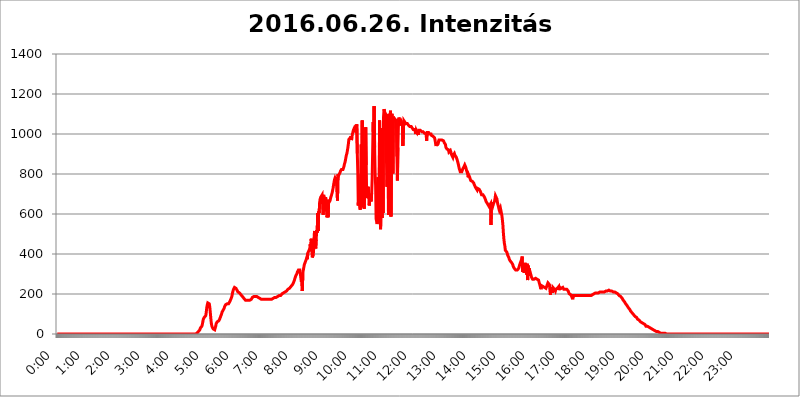
| Category | 2016.06.26. Intenzitás [W/m^2] |
|---|---|
| 0.0 | 0 |
| 0.0006944444444444445 | 0 |
| 0.001388888888888889 | 0 |
| 0.0020833333333333333 | 0 |
| 0.002777777777777778 | 0 |
| 0.003472222222222222 | 0 |
| 0.004166666666666667 | 0 |
| 0.004861111111111111 | 0 |
| 0.005555555555555556 | 0 |
| 0.0062499999999999995 | 0 |
| 0.006944444444444444 | 0 |
| 0.007638888888888889 | 0 |
| 0.008333333333333333 | 0 |
| 0.009027777777777779 | 0 |
| 0.009722222222222222 | 0 |
| 0.010416666666666666 | 0 |
| 0.011111111111111112 | 0 |
| 0.011805555555555555 | 0 |
| 0.012499999999999999 | 0 |
| 0.013194444444444444 | 0 |
| 0.013888888888888888 | 0 |
| 0.014583333333333332 | 0 |
| 0.015277777777777777 | 0 |
| 0.015972222222222224 | 0 |
| 0.016666666666666666 | 0 |
| 0.017361111111111112 | 0 |
| 0.018055555555555557 | 0 |
| 0.01875 | 0 |
| 0.019444444444444445 | 0 |
| 0.02013888888888889 | 0 |
| 0.020833333333333332 | 0 |
| 0.02152777777777778 | 0 |
| 0.022222222222222223 | 0 |
| 0.02291666666666667 | 0 |
| 0.02361111111111111 | 0 |
| 0.024305555555555556 | 0 |
| 0.024999999999999998 | 0 |
| 0.025694444444444447 | 0 |
| 0.02638888888888889 | 0 |
| 0.027083333333333334 | 0 |
| 0.027777777777777776 | 0 |
| 0.02847222222222222 | 0 |
| 0.029166666666666664 | 0 |
| 0.029861111111111113 | 0 |
| 0.030555555555555555 | 0 |
| 0.03125 | 0 |
| 0.03194444444444445 | 0 |
| 0.03263888888888889 | 0 |
| 0.03333333333333333 | 0 |
| 0.034027777777777775 | 0 |
| 0.034722222222222224 | 0 |
| 0.035416666666666666 | 0 |
| 0.036111111111111115 | 0 |
| 0.03680555555555556 | 0 |
| 0.0375 | 0 |
| 0.03819444444444444 | 0 |
| 0.03888888888888889 | 0 |
| 0.03958333333333333 | 0 |
| 0.04027777777777778 | 0 |
| 0.04097222222222222 | 0 |
| 0.041666666666666664 | 0 |
| 0.042361111111111106 | 0 |
| 0.04305555555555556 | 0 |
| 0.043750000000000004 | 0 |
| 0.044444444444444446 | 0 |
| 0.04513888888888889 | 0 |
| 0.04583333333333334 | 0 |
| 0.04652777777777778 | 0 |
| 0.04722222222222222 | 0 |
| 0.04791666666666666 | 0 |
| 0.04861111111111111 | 0 |
| 0.049305555555555554 | 0 |
| 0.049999999999999996 | 0 |
| 0.05069444444444445 | 0 |
| 0.051388888888888894 | 0 |
| 0.052083333333333336 | 0 |
| 0.05277777777777778 | 0 |
| 0.05347222222222222 | 0 |
| 0.05416666666666667 | 0 |
| 0.05486111111111111 | 0 |
| 0.05555555555555555 | 0 |
| 0.05625 | 0 |
| 0.05694444444444444 | 0 |
| 0.057638888888888885 | 0 |
| 0.05833333333333333 | 0 |
| 0.05902777777777778 | 0 |
| 0.059722222222222225 | 0 |
| 0.06041666666666667 | 0 |
| 0.061111111111111116 | 0 |
| 0.06180555555555556 | 0 |
| 0.0625 | 0 |
| 0.06319444444444444 | 0 |
| 0.06388888888888888 | 0 |
| 0.06458333333333334 | 0 |
| 0.06527777777777778 | 0 |
| 0.06597222222222222 | 0 |
| 0.06666666666666667 | 0 |
| 0.06736111111111111 | 0 |
| 0.06805555555555555 | 0 |
| 0.06874999999999999 | 0 |
| 0.06944444444444443 | 0 |
| 0.07013888888888889 | 0 |
| 0.07083333333333333 | 0 |
| 0.07152777777777779 | 0 |
| 0.07222222222222223 | 0 |
| 0.07291666666666667 | 0 |
| 0.07361111111111111 | 0 |
| 0.07430555555555556 | 0 |
| 0.075 | 0 |
| 0.07569444444444444 | 0 |
| 0.0763888888888889 | 0 |
| 0.07708333333333334 | 0 |
| 0.07777777777777778 | 0 |
| 0.07847222222222222 | 0 |
| 0.07916666666666666 | 0 |
| 0.0798611111111111 | 0 |
| 0.08055555555555556 | 0 |
| 0.08125 | 0 |
| 0.08194444444444444 | 0 |
| 0.08263888888888889 | 0 |
| 0.08333333333333333 | 0 |
| 0.08402777777777777 | 0 |
| 0.08472222222222221 | 0 |
| 0.08541666666666665 | 0 |
| 0.08611111111111112 | 0 |
| 0.08680555555555557 | 0 |
| 0.08750000000000001 | 0 |
| 0.08819444444444445 | 0 |
| 0.08888888888888889 | 0 |
| 0.08958333333333333 | 0 |
| 0.09027777777777778 | 0 |
| 0.09097222222222222 | 0 |
| 0.09166666666666667 | 0 |
| 0.09236111111111112 | 0 |
| 0.09305555555555556 | 0 |
| 0.09375 | 0 |
| 0.09444444444444444 | 0 |
| 0.09513888888888888 | 0 |
| 0.09583333333333333 | 0 |
| 0.09652777777777777 | 0 |
| 0.09722222222222222 | 0 |
| 0.09791666666666667 | 0 |
| 0.09861111111111111 | 0 |
| 0.09930555555555555 | 0 |
| 0.09999999999999999 | 0 |
| 0.10069444444444443 | 0 |
| 0.1013888888888889 | 0 |
| 0.10208333333333335 | 0 |
| 0.10277777777777779 | 0 |
| 0.10347222222222223 | 0 |
| 0.10416666666666667 | 0 |
| 0.10486111111111111 | 0 |
| 0.10555555555555556 | 0 |
| 0.10625 | 0 |
| 0.10694444444444444 | 0 |
| 0.1076388888888889 | 0 |
| 0.10833333333333334 | 0 |
| 0.10902777777777778 | 0 |
| 0.10972222222222222 | 0 |
| 0.1111111111111111 | 0 |
| 0.11180555555555556 | 0 |
| 0.11180555555555556 | 0 |
| 0.1125 | 0 |
| 0.11319444444444444 | 0 |
| 0.11388888888888889 | 0 |
| 0.11458333333333333 | 0 |
| 0.11527777777777777 | 0 |
| 0.11597222222222221 | 0 |
| 0.11666666666666665 | 0 |
| 0.1173611111111111 | 0 |
| 0.11805555555555557 | 0 |
| 0.11944444444444445 | 0 |
| 0.12013888888888889 | 0 |
| 0.12083333333333333 | 0 |
| 0.12152777777777778 | 0 |
| 0.12222222222222223 | 0 |
| 0.12291666666666667 | 0 |
| 0.12291666666666667 | 0 |
| 0.12361111111111112 | 0 |
| 0.12430555555555556 | 0 |
| 0.125 | 0 |
| 0.12569444444444444 | 0 |
| 0.12638888888888888 | 0 |
| 0.12708333333333333 | 0 |
| 0.16875 | 0 |
| 0.12847222222222224 | 0 |
| 0.12916666666666668 | 0 |
| 0.12986111111111112 | 0 |
| 0.13055555555555556 | 0 |
| 0.13125 | 0 |
| 0.13194444444444445 | 0 |
| 0.1326388888888889 | 0 |
| 0.13333333333333333 | 0 |
| 0.13402777777777777 | 0 |
| 0.13402777777777777 | 0 |
| 0.13472222222222222 | 0 |
| 0.13541666666666666 | 0 |
| 0.1361111111111111 | 0 |
| 0.13749999999999998 | 0 |
| 0.13819444444444443 | 0 |
| 0.1388888888888889 | 0 |
| 0.13958333333333334 | 0 |
| 0.14027777777777778 | 0 |
| 0.14097222222222222 | 0 |
| 0.14166666666666666 | 0 |
| 0.1423611111111111 | 0 |
| 0.14305555555555557 | 0 |
| 0.14375000000000002 | 0 |
| 0.14444444444444446 | 0 |
| 0.1451388888888889 | 0 |
| 0.1451388888888889 | 0 |
| 0.14652777777777778 | 0 |
| 0.14722222222222223 | 0 |
| 0.14791666666666667 | 0 |
| 0.1486111111111111 | 0 |
| 0.14930555555555555 | 0 |
| 0.15 | 0 |
| 0.15069444444444444 | 0 |
| 0.15138888888888888 | 0 |
| 0.15208333333333332 | 0 |
| 0.15277777777777776 | 0 |
| 0.15347222222222223 | 0 |
| 0.15416666666666667 | 0 |
| 0.15486111111111112 | 0 |
| 0.15555555555555556 | 0 |
| 0.15625 | 0 |
| 0.15694444444444444 | 0 |
| 0.15763888888888888 | 0 |
| 0.15833333333333333 | 0 |
| 0.15902777777777777 | 0 |
| 0.15972222222222224 | 0 |
| 0.16041666666666668 | 0 |
| 0.16111111111111112 | 0 |
| 0.16180555555555556 | 0 |
| 0.1625 | 0 |
| 0.16319444444444445 | 0 |
| 0.1638888888888889 | 0 |
| 0.16458333333333333 | 0 |
| 0.16527777777777777 | 0 |
| 0.16597222222222222 | 0 |
| 0.16666666666666666 | 0 |
| 0.1673611111111111 | 0 |
| 0.16805555555555554 | 0 |
| 0.16874999999999998 | 0 |
| 0.16944444444444443 | 0 |
| 0.17013888888888887 | 0 |
| 0.1708333333333333 | 0 |
| 0.17152777777777775 | 0 |
| 0.17222222222222225 | 0 |
| 0.1729166666666667 | 0 |
| 0.17361111111111113 | 0 |
| 0.17430555555555557 | 0 |
| 0.17500000000000002 | 0 |
| 0.17569444444444446 | 0 |
| 0.1763888888888889 | 0 |
| 0.17708333333333334 | 0 |
| 0.17777777777777778 | 0 |
| 0.17847222222222223 | 0 |
| 0.17916666666666667 | 0 |
| 0.1798611111111111 | 0 |
| 0.18055555555555555 | 0 |
| 0.18125 | 0 |
| 0.18194444444444444 | 0 |
| 0.1826388888888889 | 0 |
| 0.18333333333333335 | 0 |
| 0.1840277777777778 | 0 |
| 0.18472222222222223 | 0 |
| 0.18541666666666667 | 0 |
| 0.18611111111111112 | 0 |
| 0.18680555555555556 | 0 |
| 0.1875 | 0 |
| 0.18819444444444444 | 0 |
| 0.18888888888888888 | 0 |
| 0.18958333333333333 | 0 |
| 0.19027777777777777 | 0 |
| 0.1909722222222222 | 0 |
| 0.19166666666666665 | 0 |
| 0.19236111111111112 | 0 |
| 0.19305555555555554 | 0 |
| 0.19375 | 0 |
| 0.19444444444444445 | 0 |
| 0.1951388888888889 | 0 |
| 0.19583333333333333 | 3.525 |
| 0.19652777777777777 | 3.525 |
| 0.19722222222222222 | 7.887 |
| 0.19791666666666666 | 12.257 |
| 0.1986111111111111 | 16.636 |
| 0.19930555555555554 | 16.636 |
| 0.19999999999999998 | 21.024 |
| 0.20069444444444443 | 29.823 |
| 0.20138888888888887 | 29.823 |
| 0.2020833333333333 | 34.234 |
| 0.2027777777777778 | 38.653 |
| 0.2034722222222222 | 47.511 |
| 0.2041666666666667 | 60.85 |
| 0.20486111111111113 | 74.246 |
| 0.20555555555555557 | 78.722 |
| 0.20625000000000002 | 83.205 |
| 0.20694444444444446 | 83.205 |
| 0.2076388888888889 | 87.692 |
| 0.20833333333333334 | 92.184 |
| 0.20902777777777778 | 110.201 |
| 0.20972222222222223 | 132.814 |
| 0.21041666666666667 | 146.423 |
| 0.2111111111111111 | 155.509 |
| 0.21180555555555555 | 155.509 |
| 0.2125 | 155.509 |
| 0.21319444444444444 | 150.964 |
| 0.2138888888888889 | 137.347 |
| 0.21458333333333335 | 110.201 |
| 0.2152777777777778 | 83.205 |
| 0.21597222222222223 | 56.398 |
| 0.21666666666666667 | 43.079 |
| 0.21736111111111112 | 34.234 |
| 0.21805555555555556 | 29.823 |
| 0.21875 | 25.419 |
| 0.21944444444444444 | 25.419 |
| 0.22013888888888888 | 21.024 |
| 0.22083333333333333 | 21.024 |
| 0.22152777777777777 | 29.823 |
| 0.2222222222222222 | 38.653 |
| 0.22291666666666665 | 51.951 |
| 0.2236111111111111 | 56.398 |
| 0.22430555555555556 | 60.85 |
| 0.225 | 65.31 |
| 0.22569444444444445 | 65.31 |
| 0.2263888888888889 | 65.31 |
| 0.22708333333333333 | 69.775 |
| 0.22777777777777777 | 74.246 |
| 0.22847222222222222 | 78.722 |
| 0.22916666666666666 | 87.692 |
| 0.2298611111111111 | 92.184 |
| 0.23055555555555554 | 101.184 |
| 0.23124999999999998 | 110.201 |
| 0.23194444444444443 | 110.201 |
| 0.23263888888888887 | 119.235 |
| 0.2333333333333333 | 123.758 |
| 0.2340277777777778 | 128.284 |
| 0.2347222222222222 | 137.347 |
| 0.2354166666666667 | 137.347 |
| 0.23611111111111113 | 146.423 |
| 0.23680555555555557 | 150.964 |
| 0.23750000000000002 | 150.964 |
| 0.23819444444444446 | 150.964 |
| 0.2388888888888889 | 150.964 |
| 0.23958333333333334 | 150.964 |
| 0.24027777777777778 | 150.964 |
| 0.24097222222222223 | 146.423 |
| 0.24166666666666667 | 146.423 |
| 0.2423611111111111 | 164.605 |
| 0.24305555555555555 | 164.605 |
| 0.24375 | 164.605 |
| 0.24444444444444446 | 182.82 |
| 0.24513888888888888 | 191.937 |
| 0.24583333333333335 | 205.62 |
| 0.2465277777777778 | 214.746 |
| 0.24722222222222223 | 223.873 |
| 0.24791666666666667 | 228.436 |
| 0.24861111111111112 | 233 |
| 0.24930555555555556 | 233 |
| 0.25 | 233 |
| 0.25069444444444444 | 228.436 |
| 0.2513888888888889 | 223.873 |
| 0.2520833333333333 | 219.309 |
| 0.25277777777777777 | 214.746 |
| 0.2534722222222222 | 210.182 |
| 0.25416666666666665 | 210.182 |
| 0.2548611111111111 | 205.62 |
| 0.2555555555555556 | 205.62 |
| 0.25625000000000003 | 201.058 |
| 0.2569444444444445 | 201.058 |
| 0.2576388888888889 | 196.497 |
| 0.25833333333333336 | 191.937 |
| 0.2590277777777778 | 191.937 |
| 0.25972222222222224 | 187.378 |
| 0.2604166666666667 | 182.82 |
| 0.2611111111111111 | 182.82 |
| 0.26180555555555557 | 178.264 |
| 0.2625 | 173.709 |
| 0.26319444444444445 | 173.709 |
| 0.2638888888888889 | 169.156 |
| 0.26458333333333334 | 169.156 |
| 0.2652777777777778 | 169.156 |
| 0.2659722222222222 | 169.156 |
| 0.26666666666666666 | 169.156 |
| 0.2673611111111111 | 169.156 |
| 0.26805555555555555 | 169.156 |
| 0.26875 | 169.156 |
| 0.26944444444444443 | 169.156 |
| 0.2701388888888889 | 169.156 |
| 0.2708333333333333 | 169.156 |
| 0.27152777777777776 | 173.709 |
| 0.2722222222222222 | 173.709 |
| 0.27291666666666664 | 178.264 |
| 0.2736111111111111 | 182.82 |
| 0.2743055555555555 | 182.82 |
| 0.27499999999999997 | 182.82 |
| 0.27569444444444446 | 187.378 |
| 0.27638888888888885 | 187.378 |
| 0.27708333333333335 | 187.378 |
| 0.2777777777777778 | 187.378 |
| 0.27847222222222223 | 187.378 |
| 0.2791666666666667 | 187.378 |
| 0.2798611111111111 | 187.378 |
| 0.28055555555555556 | 187.378 |
| 0.28125 | 187.378 |
| 0.28194444444444444 | 182.82 |
| 0.2826388888888889 | 182.82 |
| 0.2833333333333333 | 182.82 |
| 0.28402777777777777 | 178.264 |
| 0.2847222222222222 | 178.264 |
| 0.28541666666666665 | 178.264 |
| 0.28611111111111115 | 173.709 |
| 0.28680555555555554 | 173.709 |
| 0.28750000000000003 | 173.709 |
| 0.2881944444444445 | 173.709 |
| 0.2888888888888889 | 173.709 |
| 0.28958333333333336 | 173.709 |
| 0.2902777777777778 | 173.709 |
| 0.29097222222222224 | 173.709 |
| 0.2916666666666667 | 173.709 |
| 0.2923611111111111 | 173.709 |
| 0.29305555555555557 | 173.709 |
| 0.29375 | 173.709 |
| 0.29444444444444445 | 173.709 |
| 0.2951388888888889 | 173.709 |
| 0.29583333333333334 | 173.709 |
| 0.2965277777777778 | 173.709 |
| 0.2972222222222222 | 173.709 |
| 0.29791666666666666 | 173.709 |
| 0.2986111111111111 | 173.709 |
| 0.29930555555555555 | 173.709 |
| 0.3 | 178.264 |
| 0.30069444444444443 | 173.709 |
| 0.3013888888888889 | 178.264 |
| 0.3020833333333333 | 178.264 |
| 0.30277777777777776 | 178.264 |
| 0.3034722222222222 | 178.264 |
| 0.30416666666666664 | 178.264 |
| 0.3048611111111111 | 182.82 |
| 0.3055555555555555 | 182.82 |
| 0.30624999999999997 | 182.82 |
| 0.3069444444444444 | 182.82 |
| 0.3076388888888889 | 182.82 |
| 0.30833333333333335 | 182.82 |
| 0.3090277777777778 | 187.378 |
| 0.30972222222222223 | 187.378 |
| 0.3104166666666667 | 187.378 |
| 0.3111111111111111 | 191.937 |
| 0.31180555555555556 | 191.937 |
| 0.3125 | 191.937 |
| 0.31319444444444444 | 191.937 |
| 0.3138888888888889 | 196.497 |
| 0.3145833333333333 | 196.497 |
| 0.31527777777777777 | 201.058 |
| 0.3159722222222222 | 201.058 |
| 0.31666666666666665 | 205.62 |
| 0.31736111111111115 | 205.62 |
| 0.31805555555555554 | 210.182 |
| 0.31875000000000003 | 210.182 |
| 0.3194444444444445 | 210.182 |
| 0.3201388888888889 | 214.746 |
| 0.32083333333333336 | 214.746 |
| 0.3215277777777778 | 214.746 |
| 0.32222222222222224 | 219.309 |
| 0.3229166666666667 | 219.309 |
| 0.3236111111111111 | 223.873 |
| 0.32430555555555557 | 223.873 |
| 0.325 | 228.436 |
| 0.32569444444444445 | 228.436 |
| 0.3263888888888889 | 228.436 |
| 0.32708333333333334 | 233 |
| 0.3277777777777778 | 237.564 |
| 0.3284722222222222 | 242.127 |
| 0.32916666666666666 | 242.127 |
| 0.3298611111111111 | 246.689 |
| 0.33055555555555555 | 251.251 |
| 0.33125 | 255.813 |
| 0.33194444444444443 | 260.373 |
| 0.3326388888888889 | 269.49 |
| 0.3333333333333333 | 278.603 |
| 0.3340277777777778 | 283.156 |
| 0.3347222222222222 | 292.259 |
| 0.3354166666666667 | 296.808 |
| 0.3361111111111111 | 301.354 |
| 0.3368055555555556 | 310.44 |
| 0.33749999999999997 | 314.98 |
| 0.33819444444444446 | 319.517 |
| 0.33888888888888885 | 314.98 |
| 0.33958333333333335 | 319.517 |
| 0.34027777777777773 | 319.517 |
| 0.34097222222222223 | 319.517 |
| 0.3416666666666666 | 324.052 |
| 0.3423611111111111 | 260.373 |
| 0.3430555555555555 | 274.047 |
| 0.34375 | 214.746 |
| 0.3444444444444445 | 305.898 |
| 0.3451388888888889 | 319.517 |
| 0.3458333333333334 | 324.052 |
| 0.34652777777777777 | 346.682 |
| 0.34722222222222227 | 351.198 |
| 0.34791666666666665 | 360.221 |
| 0.34861111111111115 | 364.728 |
| 0.34930555555555554 | 373.729 |
| 0.35000000000000003 | 382.715 |
| 0.3506944444444444 | 373.729 |
| 0.3513888888888889 | 400.638 |
| 0.3520833333333333 | 409.574 |
| 0.3527777777777778 | 409.574 |
| 0.3534722222222222 | 409.574 |
| 0.3541666666666667 | 427.39 |
| 0.3548611111111111 | 449.551 |
| 0.35555555555555557 | 414.035 |
| 0.35625 | 475.972 |
| 0.35694444444444445 | 431.833 |
| 0.3576388888888889 | 382.715 |
| 0.35833333333333334 | 387.202 |
| 0.3590277777777778 | 396.164 |
| 0.3597222222222222 | 427.39 |
| 0.36041666666666666 | 497.836 |
| 0.3611111111111111 | 515.223 |
| 0.36180555555555555 | 462.786 |
| 0.3625 | 427.39 |
| 0.36319444444444443 | 471.582 |
| 0.3638888888888889 | 519.555 |
| 0.3645833333333333 | 506.542 |
| 0.3652777777777778 | 604.864 |
| 0.3659722222222222 | 515.223 |
| 0.3666666666666667 | 613.252 |
| 0.3673611111111111 | 604.864 |
| 0.3680555555555556 | 658.909 |
| 0.36874999999999997 | 675.311 |
| 0.36944444444444446 | 683.473 |
| 0.37013888888888885 | 683.473 |
| 0.37083333333333335 | 683.473 |
| 0.37152777777777773 | 695.666 |
| 0.37222222222222223 | 691.608 |
| 0.3729166666666666 | 596.45 |
| 0.3736111111111111 | 695.666 |
| 0.3743055555555555 | 679.395 |
| 0.375 | 671.22 |
| 0.3756944444444445 | 613.252 |
| 0.3763888888888889 | 683.473 |
| 0.3770833333333334 | 687.544 |
| 0.37777777777777777 | 617.436 |
| 0.37847222222222227 | 583.779 |
| 0.37916666666666665 | 671.22 |
| 0.37986111111111115 | 583.779 |
| 0.38055555555555554 | 654.791 |
| 0.38125000000000003 | 658.909 |
| 0.3819444444444444 | 658.909 |
| 0.3826388888888889 | 667.123 |
| 0.3833333333333333 | 679.395 |
| 0.3840277777777778 | 687.544 |
| 0.3847222222222222 | 691.608 |
| 0.3854166666666667 | 703.762 |
| 0.3861111111111111 | 715.858 |
| 0.38680555555555557 | 727.896 |
| 0.3875 | 743.859 |
| 0.38819444444444445 | 759.723 |
| 0.3888888888888889 | 771.559 |
| 0.38958333333333334 | 779.42 |
| 0.3902777777777778 | 779.42 |
| 0.3909722222222222 | 767.62 |
| 0.39166666666666666 | 783.342 |
| 0.3923611111111111 | 787.258 |
| 0.39305555555555555 | 667.123 |
| 0.39375 | 798.974 |
| 0.39444444444444443 | 791.169 |
| 0.3951388888888889 | 791.169 |
| 0.3958333333333333 | 795.074 |
| 0.3965277777777778 | 806.757 |
| 0.3972222222222222 | 814.519 |
| 0.3979166666666667 | 818.392 |
| 0.3986111111111111 | 822.26 |
| 0.3993055555555556 | 822.26 |
| 0.39999999999999997 | 818.392 |
| 0.40069444444444446 | 822.26 |
| 0.40138888888888885 | 829.981 |
| 0.40208333333333335 | 837.682 |
| 0.40277777777777773 | 849.199 |
| 0.40347222222222223 | 856.855 |
| 0.4041666666666666 | 868.305 |
| 0.4048611111111111 | 883.516 |
| 0.4055555555555555 | 894.885 |
| 0.40625 | 902.447 |
| 0.4069444444444445 | 917.534 |
| 0.4076388888888889 | 932.576 |
| 0.4083333333333334 | 951.327 |
| 0.40902777777777777 | 973.772 |
| 0.40972222222222227 | 973.772 |
| 0.41041666666666665 | 973.772 |
| 0.41111111111111115 | 981.244 |
| 0.41180555555555554 | 988.714 |
| 0.41250000000000003 | 970.034 |
| 0.4131944444444444 | 977.508 |
| 0.4138888888888889 | 999.916 |
| 0.4145833333333333 | 1007.383 |
| 0.4152777777777778 | 1018.587 |
| 0.4159722222222222 | 1022.323 |
| 0.4166666666666667 | 1029.798 |
| 0.4173611111111111 | 1026.06 |
| 0.41805555555555557 | 1018.587 |
| 0.41875 | 1022.323 |
| 0.41944444444444445 | 1029.798 |
| 0.4201388888888889 | 1048.508 |
| 0.42083333333333334 | 902.447 |
| 0.4215277777777778 | 810.641 |
| 0.4222222222222222 | 642.4 |
| 0.42291666666666666 | 727.896 |
| 0.4236111111111111 | 667.123 |
| 0.42430555555555555 | 634.105 |
| 0.425 | 621.613 |
| 0.42569444444444443 | 798.974 |
| 0.4263888888888889 | 947.58 |
| 0.4270833333333333 | 634.105 |
| 0.4277777777777778 | 1067.267 |
| 0.4284722222222222 | 638.256 |
| 0.4291666666666667 | 707.8 |
| 0.4298611111111111 | 663.019 |
| 0.4305555555555556 | 625.784 |
| 0.43124999999999997 | 751.803 |
| 0.43194444444444446 | 826.123 |
| 0.43263888888888885 | 1033.537 |
| 0.43333333333333335 | 845.365 |
| 0.43402777777777773 | 679.395 |
| 0.43472222222222223 | 723.889 |
| 0.4354166666666666 | 691.608 |
| 0.4361111111111111 | 735.89 |
| 0.4368055555555555 | 695.666 |
| 0.4375 | 642.4 |
| 0.4381944444444445 | 663.019 |
| 0.4388888888888889 | 683.473 |
| 0.4395833333333334 | 675.311 |
| 0.44027777777777777 | 663.019 |
| 0.44097222222222227 | 703.762 |
| 0.44166666666666665 | 775.492 |
| 0.44236111111111115 | 913.766 |
| 0.44305555555555554 | 1059.756 |
| 0.44375000000000003 | 955.071 |
| 0.4444444444444444 | 1139.384 |
| 0.4451388888888889 | 932.576 |
| 0.4458333333333333 | 798.974 |
| 0.4465277777777778 | 743.859 |
| 0.4472222222222222 | 575.299 |
| 0.4479166666666667 | 571.049 |
| 0.4486111111111111 | 549.704 |
| 0.44930555555555557 | 562.53 |
| 0.45 | 783.342 |
| 0.45069444444444445 | 683.473 |
| 0.4513888888888889 | 575.299 |
| 0.45208333333333334 | 1067.267 |
| 0.4527777777777778 | 654.791 |
| 0.4534722222222222 | 523.88 |
| 0.45416666666666666 | 638.256 |
| 0.4548611111111111 | 1029.798 |
| 0.45555555555555555 | 579.542 |
| 0.45625 | 977.508 |
| 0.45694444444444443 | 604.864 |
| 0.4576388888888889 | 1086.097 |
| 0.4583333333333333 | 1124.056 |
| 0.4590277777777778 | 1112.618 |
| 0.4597222222222222 | 1116.426 |
| 0.4604166666666667 | 1101.226 |
| 0.4611111111111111 | 1097.437 |
| 0.4618055555555556 | 856.855 |
| 0.46249999999999997 | 735.89 |
| 0.46319444444444446 | 879.719 |
| 0.46388888888888885 | 1097.437 |
| 0.46458333333333335 | 596.45 |
| 0.46527777777777773 | 1101.226 |
| 0.46597222222222223 | 1093.653 |
| 0.4666666666666666 | 879.719 |
| 0.4673611111111111 | 1116.426 |
| 0.4680555555555555 | 588.009 |
| 0.46875 | 841.526 |
| 0.4694444444444445 | 1101.226 |
| 0.4701388888888889 | 1052.255 |
| 0.4708333333333334 | 802.868 |
| 0.47152777777777777 | 1086.097 |
| 0.47222222222222227 | 1078.555 |
| 0.47291666666666665 | 1074.789 |
| 0.47361111111111115 | 1074.789 |
| 0.47430555555555554 | 1071.027 |
| 0.47500000000000003 | 1056.004 |
| 0.4756944444444444 | 1074.789 |
| 0.4763888888888889 | 887.309 |
| 0.4770833333333333 | 767.62 |
| 0.4777777777777778 | 932.576 |
| 0.4784722222222222 | 1044.762 |
| 0.4791666666666667 | 1082.324 |
| 0.4798611111111111 | 1071.027 |
| 0.48055555555555557 | 1056.004 |
| 0.48125 | 1056.004 |
| 0.48194444444444445 | 1063.51 |
| 0.4826388888888889 | 1067.267 |
| 0.48333333333333334 | 1041.019 |
| 0.4840277777777778 | 1059.756 |
| 0.4847222222222222 | 940.082 |
| 0.48541666666666666 | 940.082 |
| 0.4861111111111111 | 1067.267 |
| 0.48680555555555555 | 1063.51 |
| 0.4875 | 1059.756 |
| 0.48819444444444443 | 1056.004 |
| 0.4888888888888889 | 1052.255 |
| 0.4895833333333333 | 1052.255 |
| 0.4902777777777778 | 1052.255 |
| 0.4909722222222222 | 1052.255 |
| 0.4916666666666667 | 1048.508 |
| 0.4923611111111111 | 1044.762 |
| 0.4930555555555556 | 1044.762 |
| 0.49374999999999997 | 1041.019 |
| 0.49444444444444446 | 1037.277 |
| 0.49513888888888885 | 1041.019 |
| 0.49583333333333335 | 1041.019 |
| 0.49652777777777773 | 1037.277 |
| 0.49722222222222223 | 1033.537 |
| 0.4979166666666666 | 1029.798 |
| 0.4986111111111111 | 1029.798 |
| 0.4993055555555555 | 1022.323 |
| 0.5 | 1026.06 |
| 0.5006944444444444 | 1018.587 |
| 0.5013888888888889 | 1022.323 |
| 0.5020833333333333 | 1018.587 |
| 0.5027777777777778 | 999.916 |
| 0.5034722222222222 | 1018.587 |
| 0.5041666666666667 | 1018.587 |
| 0.5048611111111111 | 1007.383 |
| 0.5055555555555555 | 1014.852 |
| 0.50625 | 996.182 |
| 0.5069444444444444 | 1018.587 |
| 0.5076388888888889 | 1018.587 |
| 0.5083333333333333 | 1018.587 |
| 0.5090277777777777 | 1018.587 |
| 0.5097222222222222 | 1018.587 |
| 0.5104166666666666 | 1014.852 |
| 0.5111111111111112 | 1011.118 |
| 0.5118055555555555 | 1011.118 |
| 0.5125000000000001 | 1014.852 |
| 0.5131944444444444 | 1011.118 |
| 0.513888888888889 | 1011.118 |
| 0.5145833333333333 | 1007.383 |
| 0.5152777777777778 | 1003.65 |
| 0.5159722222222222 | 1003.65 |
| 0.5166666666666667 | 1007.383 |
| 0.517361111111111 | 999.916 |
| 0.5180555555555556 | 966.295 |
| 0.5187499999999999 | 1007.383 |
| 0.5194444444444445 | 1011.118 |
| 0.5201388888888888 | 1007.383 |
| 0.5208333333333334 | 1007.383 |
| 0.5215277777777778 | 1003.65 |
| 0.5222222222222223 | 999.916 |
| 0.5229166666666667 | 1003.65 |
| 0.5236111111111111 | 999.916 |
| 0.5243055555555556 | 999.916 |
| 0.525 | 992.448 |
| 0.5256944444444445 | 988.714 |
| 0.5263888888888889 | 988.714 |
| 0.5270833333333333 | 988.714 |
| 0.5277777777777778 | 992.448 |
| 0.5284722222222222 | 984.98 |
| 0.5291666666666667 | 981.244 |
| 0.5298611111111111 | 970.034 |
| 0.5305555555555556 | 955.071 |
| 0.53125 | 940.082 |
| 0.5319444444444444 | 947.58 |
| 0.5326388888888889 | 958.814 |
| 0.5333333333333333 | 943.832 |
| 0.5340277777777778 | 940.082 |
| 0.5347222222222222 | 962.555 |
| 0.5354166666666667 | 970.034 |
| 0.5361111111111111 | 970.034 |
| 0.5368055555555555 | 970.034 |
| 0.5375 | 970.034 |
| 0.5381944444444444 | 973.772 |
| 0.5388888888888889 | 973.772 |
| 0.5395833333333333 | 970.034 |
| 0.5402777777777777 | 970.034 |
| 0.5409722222222222 | 966.295 |
| 0.5416666666666666 | 966.295 |
| 0.5423611111111112 | 962.555 |
| 0.5430555555555555 | 955.071 |
| 0.5437500000000001 | 951.327 |
| 0.5444444444444444 | 947.58 |
| 0.545138888888889 | 932.576 |
| 0.5458333333333333 | 936.33 |
| 0.5465277777777778 | 925.06 |
| 0.5472222222222222 | 925.06 |
| 0.5479166666666667 | 925.06 |
| 0.548611111111111 | 921.298 |
| 0.5493055555555556 | 909.996 |
| 0.5499999999999999 | 909.996 |
| 0.5506944444444445 | 913.766 |
| 0.5513888888888888 | 917.534 |
| 0.5520833333333334 | 909.996 |
| 0.5527777777777778 | 898.668 |
| 0.5534722222222223 | 894.885 |
| 0.5541666666666667 | 894.885 |
| 0.5548611111111111 | 883.516 |
| 0.5555555555555556 | 894.885 |
| 0.55625 | 894.885 |
| 0.5569444444444445 | 902.447 |
| 0.5576388888888889 | 894.885 |
| 0.5583333333333333 | 894.885 |
| 0.5590277777777778 | 891.099 |
| 0.5597222222222222 | 883.516 |
| 0.5604166666666667 | 875.918 |
| 0.5611111111111111 | 868.305 |
| 0.5618055555555556 | 864.493 |
| 0.5625 | 849.199 |
| 0.5631944444444444 | 837.682 |
| 0.5638888888888889 | 826.123 |
| 0.5645833333333333 | 818.392 |
| 0.5652777777777778 | 810.641 |
| 0.5659722222222222 | 810.641 |
| 0.5666666666666667 | 810.641 |
| 0.5673611111111111 | 810.641 |
| 0.5680555555555555 | 814.519 |
| 0.56875 | 826.123 |
| 0.5694444444444444 | 829.981 |
| 0.5701388888888889 | 833.834 |
| 0.5708333333333333 | 837.682 |
| 0.5715277777777777 | 845.365 |
| 0.5722222222222222 | 841.526 |
| 0.5729166666666666 | 833.834 |
| 0.5736111111111112 | 829.981 |
| 0.5743055555555555 | 814.519 |
| 0.5750000000000001 | 806.757 |
| 0.5756944444444444 | 798.974 |
| 0.576388888888889 | 783.342 |
| 0.5770833333333333 | 795.074 |
| 0.5777777777777778 | 791.169 |
| 0.5784722222222222 | 783.342 |
| 0.5791666666666667 | 775.492 |
| 0.579861111111111 | 767.62 |
| 0.5805555555555556 | 763.674 |
| 0.5812499999999999 | 767.62 |
| 0.5819444444444445 | 763.674 |
| 0.5826388888888888 | 763.674 |
| 0.5833333333333334 | 759.723 |
| 0.5840277777777778 | 755.766 |
| 0.5847222222222223 | 747.834 |
| 0.5854166666666667 | 747.834 |
| 0.5861111111111111 | 743.859 |
| 0.5868055555555556 | 731.896 |
| 0.5875 | 731.896 |
| 0.5881944444444445 | 727.896 |
| 0.5888888888888889 | 719.877 |
| 0.5895833333333333 | 727.896 |
| 0.5902777777777778 | 727.896 |
| 0.5909722222222222 | 727.896 |
| 0.5916666666666667 | 723.889 |
| 0.5923611111111111 | 719.877 |
| 0.5930555555555556 | 715.858 |
| 0.59375 | 711.832 |
| 0.5944444444444444 | 703.762 |
| 0.5951388888888889 | 695.666 |
| 0.5958333333333333 | 699.717 |
| 0.5965277777777778 | 699.717 |
| 0.5972222222222222 | 695.666 |
| 0.5979166666666667 | 695.666 |
| 0.5986111111111111 | 691.608 |
| 0.5993055555555555 | 683.473 |
| 0.6 | 679.395 |
| 0.6006944444444444 | 671.22 |
| 0.6013888888888889 | 663.019 |
| 0.6020833333333333 | 658.909 |
| 0.6027777777777777 | 654.791 |
| 0.6034722222222222 | 650.667 |
| 0.6041666666666666 | 646.537 |
| 0.6048611111111112 | 642.4 |
| 0.6055555555555555 | 638.256 |
| 0.6062500000000001 | 634.105 |
| 0.6069444444444444 | 642.4 |
| 0.607638888888889 | 650.667 |
| 0.6083333333333333 | 545.416 |
| 0.6090277777777778 | 646.537 |
| 0.6097222222222222 | 658.909 |
| 0.6104166666666667 | 650.667 |
| 0.611111111111111 | 642.4 |
| 0.6118055555555556 | 650.667 |
| 0.6124999999999999 | 654.791 |
| 0.6131944444444445 | 663.019 |
| 0.6138888888888888 | 675.311 |
| 0.6145833333333334 | 691.608 |
| 0.6152777777777778 | 695.666 |
| 0.6159722222222223 | 687.544 |
| 0.6166666666666667 | 675.311 |
| 0.6173611111111111 | 658.909 |
| 0.6180555555555556 | 646.537 |
| 0.61875 | 638.256 |
| 0.6194444444444445 | 625.784 |
| 0.6201388888888889 | 617.436 |
| 0.6208333333333333 | 621.613 |
| 0.6215277777777778 | 629.948 |
| 0.6222222222222222 | 634.105 |
| 0.6229166666666667 | 625.784 |
| 0.6236111111111111 | 592.233 |
| 0.6243055555555556 | 571.049 |
| 0.625 | 545.416 |
| 0.6256944444444444 | 506.542 |
| 0.6263888888888889 | 475.972 |
| 0.6270833333333333 | 453.968 |
| 0.6277777777777778 | 440.702 |
| 0.6284722222222222 | 418.492 |
| 0.6291666666666667 | 418.492 |
| 0.6298611111111111 | 414.035 |
| 0.6305555555555555 | 409.574 |
| 0.63125 | 400.638 |
| 0.6319444444444444 | 391.685 |
| 0.6326388888888889 | 387.202 |
| 0.6333333333333333 | 382.715 |
| 0.6340277777777777 | 373.729 |
| 0.6347222222222222 | 369.23 |
| 0.6354166666666666 | 364.728 |
| 0.6361111111111112 | 364.728 |
| 0.6368055555555555 | 360.221 |
| 0.6375000000000001 | 355.712 |
| 0.6381944444444444 | 351.198 |
| 0.638888888888889 | 346.682 |
| 0.6395833333333333 | 337.639 |
| 0.6402777777777778 | 333.113 |
| 0.6409722222222222 | 328.584 |
| 0.6416666666666667 | 324.052 |
| 0.642361111111111 | 324.052 |
| 0.6430555555555556 | 319.517 |
| 0.6437499999999999 | 319.517 |
| 0.6444444444444445 | 319.517 |
| 0.6451388888888888 | 319.517 |
| 0.6458333333333334 | 324.052 |
| 0.6465277777777778 | 324.052 |
| 0.6472222222222223 | 328.584 |
| 0.6479166666666667 | 337.639 |
| 0.6486111111111111 | 346.682 |
| 0.6493055555555556 | 351.198 |
| 0.65 | 360.221 |
| 0.6506944444444445 | 364.728 |
| 0.6513888888888889 | 373.729 |
| 0.6520833333333333 | 387.202 |
| 0.6527777777777778 | 310.44 |
| 0.6534722222222222 | 328.584 |
| 0.6541666666666667 | 319.517 |
| 0.6548611111111111 | 305.898 |
| 0.6555555555555556 | 310.44 |
| 0.65625 | 355.712 |
| 0.6569444444444444 | 360.221 |
| 0.6576388888888889 | 310.44 |
| 0.6583333333333333 | 296.808 |
| 0.6590277777777778 | 351.198 |
| 0.6597222222222222 | 269.49 |
| 0.6604166666666667 | 342.162 |
| 0.6611111111111111 | 292.259 |
| 0.6618055555555555 | 328.584 |
| 0.6625 | 319.517 |
| 0.6631944444444444 | 310.44 |
| 0.6638888888888889 | 301.354 |
| 0.6645833333333333 | 296.808 |
| 0.6652777777777777 | 283.156 |
| 0.6659722222222222 | 278.603 |
| 0.6666666666666666 | 274.047 |
| 0.6673611111111111 | 269.49 |
| 0.6680555555555556 | 274.047 |
| 0.6687500000000001 | 274.047 |
| 0.6694444444444444 | 278.603 |
| 0.6701388888888888 | 278.603 |
| 0.6708333333333334 | 278.603 |
| 0.6715277777777778 | 278.603 |
| 0.6722222222222222 | 274.047 |
| 0.6729166666666666 | 274.047 |
| 0.6736111111111112 | 274.047 |
| 0.6743055555555556 | 274.047 |
| 0.6749999999999999 | 269.49 |
| 0.6756944444444444 | 264.932 |
| 0.6763888888888889 | 251.251 |
| 0.6770833333333334 | 251.251 |
| 0.6777777777777777 | 233 |
| 0.6784722222222223 | 223.873 |
| 0.6791666666666667 | 242.127 |
| 0.6798611111111111 | 242.127 |
| 0.6805555555555555 | 237.564 |
| 0.68125 | 237.564 |
| 0.6819444444444445 | 237.564 |
| 0.6826388888888889 | 233 |
| 0.6833333333333332 | 233 |
| 0.6840277777777778 | 233 |
| 0.6847222222222222 | 233 |
| 0.6854166666666667 | 228.436 |
| 0.686111111111111 | 233 |
| 0.6868055555555556 | 242.127 |
| 0.6875 | 246.689 |
| 0.6881944444444444 | 255.813 |
| 0.688888888888889 | 260.373 |
| 0.6895833333333333 | 251.251 |
| 0.6902777777777778 | 246.689 |
| 0.6909722222222222 | 242.127 |
| 0.6916666666666668 | 196.497 |
| 0.6923611111111111 | 233 |
| 0.6930555555555555 | 233 |
| 0.69375 | 233 |
| 0.6944444444444445 | 205.62 |
| 0.6951388888888889 | 233 |
| 0.6958333333333333 | 233 |
| 0.6965277777777777 | 228.436 |
| 0.6972222222222223 | 223.873 |
| 0.6979166666666666 | 223.873 |
| 0.6986111111111111 | 214.746 |
| 0.6993055555555556 | 223.873 |
| 0.7000000000000001 | 219.309 |
| 0.7006944444444444 | 228.436 |
| 0.7013888888888888 | 228.436 |
| 0.7020833333333334 | 233 |
| 0.7027777777777778 | 223.873 |
| 0.7034722222222222 | 237.564 |
| 0.7041666666666666 | 219.309 |
| 0.7048611111111112 | 233 |
| 0.7055555555555556 | 233 |
| 0.7062499999999999 | 233 |
| 0.7069444444444444 | 228.436 |
| 0.7076388888888889 | 233 |
| 0.7083333333333334 | 233 |
| 0.7090277777777777 | 233 |
| 0.7097222222222223 | 228.436 |
| 0.7104166666666667 | 223.873 |
| 0.7111111111111111 | 223.873 |
| 0.7118055555555555 | 223.873 |
| 0.7125 | 223.873 |
| 0.7131944444444445 | 223.873 |
| 0.7138888888888889 | 223.873 |
| 0.7145833333333332 | 223.873 |
| 0.7152777777777778 | 219.309 |
| 0.7159722222222222 | 219.309 |
| 0.7166666666666667 | 214.746 |
| 0.717361111111111 | 210.182 |
| 0.7180555555555556 | 201.058 |
| 0.71875 | 201.058 |
| 0.7194444444444444 | 201.058 |
| 0.720138888888889 | 196.497 |
| 0.7208333333333333 | 191.937 |
| 0.7215277777777778 | 187.378 |
| 0.7222222222222222 | 182.82 |
| 0.7229166666666668 | 173.709 |
| 0.7236111111111111 | 191.937 |
| 0.7243055555555555 | 191.937 |
| 0.725 | 191.937 |
| 0.7256944444444445 | 191.937 |
| 0.7263888888888889 | 191.937 |
| 0.7270833333333333 | 191.937 |
| 0.7277777777777777 | 191.937 |
| 0.7284722222222223 | 191.937 |
| 0.7291666666666666 | 191.937 |
| 0.7298611111111111 | 191.937 |
| 0.7305555555555556 | 191.937 |
| 0.7312500000000001 | 191.937 |
| 0.7319444444444444 | 191.937 |
| 0.7326388888888888 | 191.937 |
| 0.7333333333333334 | 191.937 |
| 0.7340277777777778 | 191.937 |
| 0.7347222222222222 | 191.937 |
| 0.7354166666666666 | 191.937 |
| 0.7361111111111112 | 191.937 |
| 0.7368055555555556 | 191.937 |
| 0.7374999999999999 | 191.937 |
| 0.7381944444444444 | 191.937 |
| 0.7388888888888889 | 191.937 |
| 0.7395833333333334 | 191.937 |
| 0.7402777777777777 | 191.937 |
| 0.7409722222222223 | 191.937 |
| 0.7416666666666667 | 191.937 |
| 0.7423611111111111 | 191.937 |
| 0.7430555555555555 | 191.937 |
| 0.74375 | 191.937 |
| 0.7444444444444445 | 191.937 |
| 0.7451388888888889 | 191.937 |
| 0.7458333333333332 | 191.937 |
| 0.7465277777777778 | 191.937 |
| 0.7472222222222222 | 191.937 |
| 0.7479166666666667 | 191.937 |
| 0.748611111111111 | 191.937 |
| 0.7493055555555556 | 191.937 |
| 0.75 | 196.497 |
| 0.7506944444444444 | 196.497 |
| 0.751388888888889 | 196.497 |
| 0.7520833333333333 | 196.497 |
| 0.7527777777777778 | 201.058 |
| 0.7534722222222222 | 201.058 |
| 0.7541666666666668 | 201.058 |
| 0.7548611111111111 | 205.62 |
| 0.7555555555555555 | 201.058 |
| 0.75625 | 205.62 |
| 0.7569444444444445 | 205.62 |
| 0.7576388888888889 | 205.62 |
| 0.7583333333333333 | 205.62 |
| 0.7590277777777777 | 205.62 |
| 0.7597222222222223 | 210.182 |
| 0.7604166666666666 | 205.62 |
| 0.7611111111111111 | 210.182 |
| 0.7618055555555556 | 210.182 |
| 0.7625000000000001 | 210.182 |
| 0.7631944444444444 | 210.182 |
| 0.7638888888888888 | 210.182 |
| 0.7645833333333334 | 210.182 |
| 0.7652777777777778 | 210.182 |
| 0.7659722222222222 | 210.182 |
| 0.7666666666666666 | 210.182 |
| 0.7673611111111112 | 210.182 |
| 0.7680555555555556 | 214.746 |
| 0.7687499999999999 | 214.746 |
| 0.7694444444444444 | 214.746 |
| 0.7701388888888889 | 214.746 |
| 0.7708333333333334 | 214.746 |
| 0.7715277777777777 | 214.746 |
| 0.7722222222222223 | 219.309 |
| 0.7729166666666667 | 219.309 |
| 0.7736111111111111 | 219.309 |
| 0.7743055555555555 | 219.309 |
| 0.775 | 219.309 |
| 0.7756944444444445 | 214.746 |
| 0.7763888888888889 | 219.309 |
| 0.7770833333333332 | 214.746 |
| 0.7777777777777778 | 214.746 |
| 0.7784722222222222 | 214.746 |
| 0.7791666666666667 | 214.746 |
| 0.779861111111111 | 210.182 |
| 0.7805555555555556 | 210.182 |
| 0.78125 | 210.182 |
| 0.7819444444444444 | 210.182 |
| 0.782638888888889 | 205.62 |
| 0.7833333333333333 | 205.62 |
| 0.7840277777777778 | 205.62 |
| 0.7847222222222222 | 201.058 |
| 0.7854166666666668 | 201.058 |
| 0.7861111111111111 | 201.058 |
| 0.7868055555555555 | 201.058 |
| 0.7875 | 196.497 |
| 0.7881944444444445 | 191.937 |
| 0.7888888888888889 | 191.937 |
| 0.7895833333333333 | 191.937 |
| 0.7902777777777777 | 187.378 |
| 0.7909722222222223 | 182.82 |
| 0.7916666666666666 | 182.82 |
| 0.7923611111111111 | 178.264 |
| 0.7930555555555556 | 173.709 |
| 0.7937500000000001 | 169.156 |
| 0.7944444444444444 | 169.156 |
| 0.7951388888888888 | 164.605 |
| 0.7958333333333334 | 160.056 |
| 0.7965277777777778 | 155.509 |
| 0.7972222222222222 | 150.964 |
| 0.7979166666666666 | 146.423 |
| 0.7986111111111112 | 146.423 |
| 0.7993055555555556 | 141.884 |
| 0.7999999999999999 | 137.347 |
| 0.8006944444444444 | 132.814 |
| 0.8013888888888889 | 128.284 |
| 0.8020833333333334 | 128.284 |
| 0.8027777777777777 | 123.758 |
| 0.8034722222222223 | 119.235 |
| 0.8041666666666667 | 114.716 |
| 0.8048611111111111 | 114.716 |
| 0.8055555555555555 | 110.201 |
| 0.80625 | 105.69 |
| 0.8069444444444445 | 105.69 |
| 0.8076388888888889 | 101.184 |
| 0.8083333333333332 | 96.682 |
| 0.8090277777777778 | 96.682 |
| 0.8097222222222222 | 92.184 |
| 0.8104166666666667 | 87.692 |
| 0.811111111111111 | 87.692 |
| 0.8118055555555556 | 83.205 |
| 0.8125 | 83.205 |
| 0.8131944444444444 | 78.722 |
| 0.813888888888889 | 74.246 |
| 0.8145833333333333 | 74.246 |
| 0.8152777777777778 | 69.775 |
| 0.8159722222222222 | 69.775 |
| 0.8166666666666668 | 65.31 |
| 0.8173611111111111 | 65.31 |
| 0.8180555555555555 | 60.85 |
| 0.81875 | 60.85 |
| 0.8194444444444445 | 56.398 |
| 0.8201388888888889 | 56.398 |
| 0.8208333333333333 | 56.398 |
| 0.8215277777777777 | 51.951 |
| 0.8222222222222223 | 51.951 |
| 0.8229166666666666 | 47.511 |
| 0.8236111111111111 | 47.511 |
| 0.8243055555555556 | 47.511 |
| 0.8250000000000001 | 43.079 |
| 0.8256944444444444 | 38.653 |
| 0.8263888888888888 | 38.653 |
| 0.8270833333333334 | 38.653 |
| 0.8277777777777778 | 38.653 |
| 0.8284722222222222 | 34.234 |
| 0.8291666666666666 | 34.234 |
| 0.8298611111111112 | 34.234 |
| 0.8305555555555556 | 29.823 |
| 0.8312499999999999 | 29.823 |
| 0.8319444444444444 | 29.823 |
| 0.8326388888888889 | 25.419 |
| 0.8333333333333334 | 25.419 |
| 0.8340277777777777 | 25.419 |
| 0.8347222222222223 | 21.024 |
| 0.8354166666666667 | 21.024 |
| 0.8361111111111111 | 21.024 |
| 0.8368055555555555 | 21.024 |
| 0.8375 | 16.636 |
| 0.8381944444444445 | 16.636 |
| 0.8388888888888889 | 16.636 |
| 0.8395833333333332 | 12.257 |
| 0.8402777777777778 | 12.257 |
| 0.8409722222222222 | 12.257 |
| 0.8416666666666667 | 12.257 |
| 0.842361111111111 | 12.257 |
| 0.8430555555555556 | 7.887 |
| 0.84375 | 7.887 |
| 0.8444444444444444 | 7.887 |
| 0.845138888888889 | 7.887 |
| 0.8458333333333333 | 7.887 |
| 0.8465277777777778 | 3.525 |
| 0.8472222222222222 | 3.525 |
| 0.8479166666666668 | 3.525 |
| 0.8486111111111111 | 3.525 |
| 0.8493055555555555 | 3.525 |
| 0.85 | 3.525 |
| 0.8506944444444445 | 3.525 |
| 0.8513888888888889 | 3.525 |
| 0.8520833333333333 | 3.525 |
| 0.8527777777777777 | 3.525 |
| 0.8534722222222223 | 0 |
| 0.8541666666666666 | 0 |
| 0.8548611111111111 | 0 |
| 0.8555555555555556 | 0 |
| 0.8562500000000001 | 0 |
| 0.8569444444444444 | 0 |
| 0.8576388888888888 | 0 |
| 0.8583333333333334 | 0 |
| 0.8590277777777778 | 0 |
| 0.8597222222222222 | 0 |
| 0.8604166666666666 | 0 |
| 0.8611111111111112 | 0 |
| 0.8618055555555556 | 0 |
| 0.8624999999999999 | 0 |
| 0.8631944444444444 | 0 |
| 0.8638888888888889 | 0 |
| 0.8645833333333334 | 0 |
| 0.8652777777777777 | 0 |
| 0.8659722222222223 | 0 |
| 0.8666666666666667 | 0 |
| 0.8673611111111111 | 0 |
| 0.8680555555555555 | 0 |
| 0.86875 | 0 |
| 0.8694444444444445 | 0 |
| 0.8701388888888889 | 0 |
| 0.8708333333333332 | 0 |
| 0.8715277777777778 | 0 |
| 0.8722222222222222 | 0 |
| 0.8729166666666667 | 0 |
| 0.873611111111111 | 0 |
| 0.8743055555555556 | 0 |
| 0.875 | 0 |
| 0.8756944444444444 | 0 |
| 0.876388888888889 | 0 |
| 0.8770833333333333 | 0 |
| 0.8777777777777778 | 0 |
| 0.8784722222222222 | 0 |
| 0.8791666666666668 | 0 |
| 0.8798611111111111 | 0 |
| 0.8805555555555555 | 0 |
| 0.88125 | 0 |
| 0.8819444444444445 | 0 |
| 0.8826388888888889 | 0 |
| 0.8833333333333333 | 0 |
| 0.8840277777777777 | 0 |
| 0.8847222222222223 | 0 |
| 0.8854166666666666 | 0 |
| 0.8861111111111111 | 0 |
| 0.8868055555555556 | 0 |
| 0.8875000000000001 | 0 |
| 0.8881944444444444 | 0 |
| 0.8888888888888888 | 0 |
| 0.8895833333333334 | 0 |
| 0.8902777777777778 | 0 |
| 0.8909722222222222 | 0 |
| 0.8916666666666666 | 0 |
| 0.8923611111111112 | 0 |
| 0.8930555555555556 | 0 |
| 0.8937499999999999 | 0 |
| 0.8944444444444444 | 0 |
| 0.8951388888888889 | 0 |
| 0.8958333333333334 | 0 |
| 0.8965277777777777 | 0 |
| 0.8972222222222223 | 0 |
| 0.8979166666666667 | 0 |
| 0.8986111111111111 | 0 |
| 0.8993055555555555 | 0 |
| 0.9 | 0 |
| 0.9006944444444445 | 0 |
| 0.9013888888888889 | 0 |
| 0.9020833333333332 | 0 |
| 0.9027777777777778 | 0 |
| 0.9034722222222222 | 0 |
| 0.9041666666666667 | 0 |
| 0.904861111111111 | 0 |
| 0.9055555555555556 | 0 |
| 0.90625 | 0 |
| 0.9069444444444444 | 0 |
| 0.907638888888889 | 0 |
| 0.9083333333333333 | 0 |
| 0.9090277777777778 | 0 |
| 0.9097222222222222 | 0 |
| 0.9104166666666668 | 0 |
| 0.9111111111111111 | 0 |
| 0.9118055555555555 | 0 |
| 0.9125 | 0 |
| 0.9131944444444445 | 0 |
| 0.9138888888888889 | 0 |
| 0.9145833333333333 | 0 |
| 0.9152777777777777 | 0 |
| 0.9159722222222223 | 0 |
| 0.9166666666666666 | 0 |
| 0.9173611111111111 | 0 |
| 0.9180555555555556 | 0 |
| 0.9187500000000001 | 0 |
| 0.9194444444444444 | 0 |
| 0.9201388888888888 | 0 |
| 0.9208333333333334 | 0 |
| 0.9215277777777778 | 0 |
| 0.9222222222222222 | 0 |
| 0.9229166666666666 | 0 |
| 0.9236111111111112 | 0 |
| 0.9243055555555556 | 0 |
| 0.9249999999999999 | 0 |
| 0.9256944444444444 | 0 |
| 0.9263888888888889 | 0 |
| 0.9270833333333334 | 0 |
| 0.9277777777777777 | 0 |
| 0.9284722222222223 | 0 |
| 0.9291666666666667 | 0 |
| 0.9298611111111111 | 0 |
| 0.9305555555555555 | 0 |
| 0.93125 | 0 |
| 0.9319444444444445 | 0 |
| 0.9326388888888889 | 0 |
| 0.9333333333333332 | 0 |
| 0.9340277777777778 | 0 |
| 0.9347222222222222 | 0 |
| 0.9354166666666667 | 0 |
| 0.936111111111111 | 0 |
| 0.9368055555555556 | 0 |
| 0.9375 | 0 |
| 0.9381944444444444 | 0 |
| 0.938888888888889 | 0 |
| 0.9395833333333333 | 0 |
| 0.9402777777777778 | 0 |
| 0.9409722222222222 | 0 |
| 0.9416666666666668 | 0 |
| 0.9423611111111111 | 0 |
| 0.9430555555555555 | 0 |
| 0.94375 | 0 |
| 0.9444444444444445 | 0 |
| 0.9451388888888889 | 0 |
| 0.9458333333333333 | 0 |
| 0.9465277777777777 | 0 |
| 0.9472222222222223 | 0 |
| 0.9479166666666666 | 0 |
| 0.9486111111111111 | 0 |
| 0.9493055555555556 | 0 |
| 0.9500000000000001 | 0 |
| 0.9506944444444444 | 0 |
| 0.9513888888888888 | 0 |
| 0.9520833333333334 | 0 |
| 0.9527777777777778 | 0 |
| 0.9534722222222222 | 0 |
| 0.9541666666666666 | 0 |
| 0.9548611111111112 | 0 |
| 0.9555555555555556 | 0 |
| 0.9562499999999999 | 0 |
| 0.9569444444444444 | 0 |
| 0.9576388888888889 | 0 |
| 0.9583333333333334 | 0 |
| 0.9590277777777777 | 0 |
| 0.9597222222222223 | 0 |
| 0.9604166666666667 | 0 |
| 0.9611111111111111 | 0 |
| 0.9618055555555555 | 0 |
| 0.9625 | 0 |
| 0.9631944444444445 | 0 |
| 0.9638888888888889 | 0 |
| 0.9645833333333332 | 0 |
| 0.9652777777777778 | 0 |
| 0.9659722222222222 | 0 |
| 0.9666666666666667 | 0 |
| 0.967361111111111 | 0 |
| 0.9680555555555556 | 0 |
| 0.96875 | 0 |
| 0.9694444444444444 | 0 |
| 0.970138888888889 | 0 |
| 0.9708333333333333 | 0 |
| 0.9715277777777778 | 0 |
| 0.9722222222222222 | 0 |
| 0.9729166666666668 | 0 |
| 0.9736111111111111 | 0 |
| 0.9743055555555555 | 0 |
| 0.975 | 0 |
| 0.9756944444444445 | 0 |
| 0.9763888888888889 | 0 |
| 0.9770833333333333 | 0 |
| 0.9777777777777777 | 0 |
| 0.9784722222222223 | 0 |
| 0.9791666666666666 | 0 |
| 0.9798611111111111 | 0 |
| 0.9805555555555556 | 0 |
| 0.9812500000000001 | 0 |
| 0.9819444444444444 | 0 |
| 0.9826388888888888 | 0 |
| 0.9833333333333334 | 0 |
| 0.9840277777777778 | 0 |
| 0.9847222222222222 | 0 |
| 0.9854166666666666 | 0 |
| 0.9861111111111112 | 0 |
| 0.9868055555555556 | 0 |
| 0.9874999999999999 | 0 |
| 0.9881944444444444 | 0 |
| 0.9888888888888889 | 0 |
| 0.9895833333333334 | 0 |
| 0.9902777777777777 | 0 |
| 0.9909722222222223 | 0 |
| 0.9916666666666667 | 0 |
| 0.9923611111111111 | 0 |
| 0.9930555555555555 | 0 |
| 0.99375 | 0 |
| 0.9944444444444445 | 0 |
| 0.9951388888888889 | 0 |
| 0.9958333333333332 | 0 |
| 0.9965277777777778 | 0 |
| 0.9972222222222222 | 0 |
| 0.9979166666666667 | 0 |
| 0.998611111111111 | 0 |
| 0.9993055555555556 | 0 |